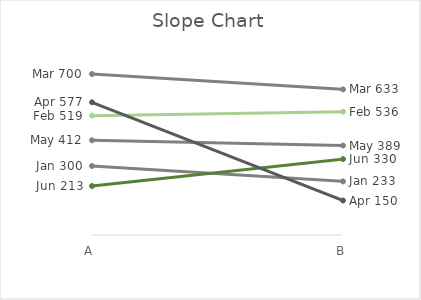
| Category | Jan | Feb | Mar | May | Jun | Apr |
|---|---|---|---|---|---|---|
| A | 300 | 519 | 700 | 412 | 213 | 577 |
| B | 233 | 536 | 633 | 389 | 330 | 150 |